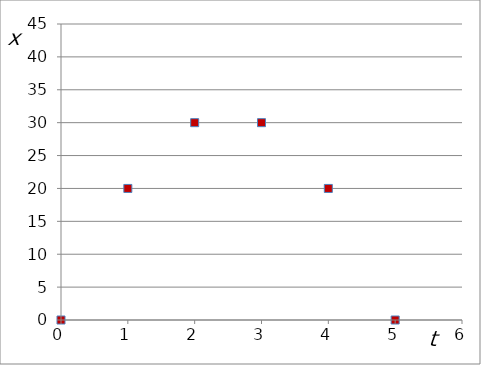
| Category | x |
|---|---|
| 0.0 | 0 |
| 1.0 | 20 |
| 2.0 | 30 |
| 3.0 | 30 |
| 4.0 | 20 |
| 5.0 | 0 |